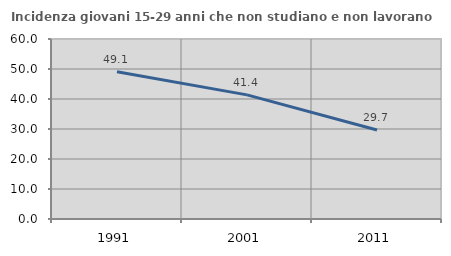
| Category | Incidenza giovani 15-29 anni che non studiano e non lavorano  |
|---|---|
| 1991.0 | 49.083 |
| 2001.0 | 41.374 |
| 2011.0 | 29.654 |